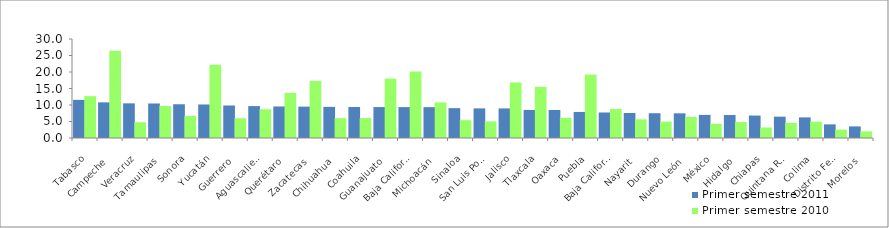
| Category | Primer semestre 2011 | Primer semestre 2010 |
|---|---|---|
| Tabasco | 11.551 | 12.678 |
| Campeche | 10.801 | 26.448 |
| Veracruz | 10.502 | 4.779 |
| Tamaulipas | 10.462 | 9.697 |
| Sonora | 10.223 | 6.66 |
| Yucatán | 10.162 | 22.164 |
| Guerrero | 9.846 | 6.001 |
| Aguascalientes | 9.668 | 8.714 |
| Querétaro | 9.559 | 13.64 |
| Zacatecas | 9.505 | 17.319 |
| Chihuahua | 9.432 | 6.013 |
| Coahuila | 9.397 | 6.057 |
| Guanajuato | 9.381 | 17.999 |
| Baja California Sur | 9.359 | 20.133 |
| Michoacán | 9.347 | 10.783 |
| Sinaloa | 9.047 | 5.404 |
| San Luis Potosí | 8.974 | 5.055 |
| Jalisco | 8.966 | 16.832 |
| Tlaxcala | 8.506 | 15.523 |
| Oaxaca | 8.496 | 6.119 |
| Puebla | 7.895 | 19.218 |
| Baja California | 7.73 | 8.807 |
| Nayarit | 7.575 | 5.662 |
| Durango | 7.509 | 4.96 |
| Nuevo León | 7.474 | 6.399 |
| México | 6.998 | 4.304 |
| Hidalgo | 6.961 | 4.83 |
| Chiapas | 6.8 | 3.195 |
| Quintana Roo | 6.469 | 4.571 |
| Colima | 6.25 | 4.946 |
| Distrito Federal | 4.131 | 2.542 |
| Morelos | 3.515 | 2.016 |